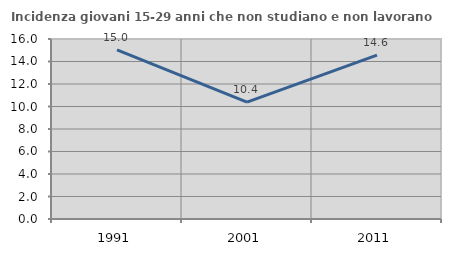
| Category | Incidenza giovani 15-29 anni che non studiano e non lavorano  |
|---|---|
| 1991.0 | 15.033 |
| 2001.0 | 10.386 |
| 2011.0 | 14.567 |